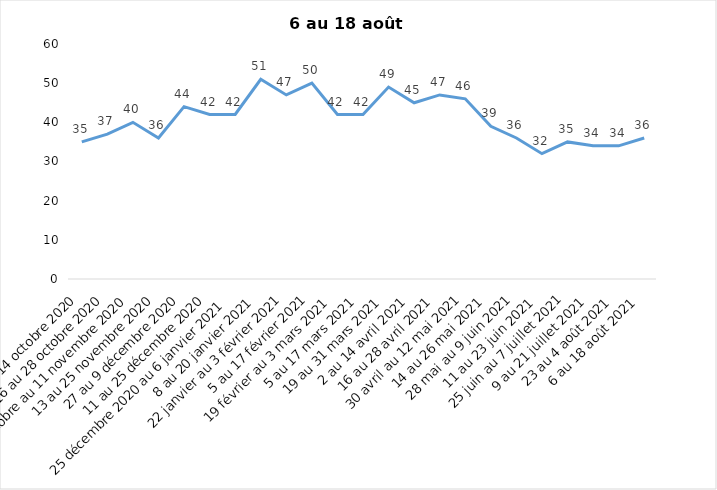
| Category | Toujours aux trois mesures |
|---|---|
| 2 au 14 octobre 2020 | 35 |
| 16 au 28 octobre 2020 | 37 |
| 30 octobre au 11 novembre 2020 | 40 |
| 13 au 25 novembre 2020 | 36 |
| 27 au 9 décembre 2020 | 44 |
| 11 au 25 décembre 2020 | 42 |
| 25 décembre 2020 au 6 janvier 2021 | 42 |
| 8 au 20 janvier 2021 | 51 |
| 22 janvier au 3 février 2021 | 47 |
| 5 au 17 février 2021 | 50 |
| 19 février au 3 mars 2021 | 42 |
| 5 au 17 mars 2021 | 42 |
| 19 au 31 mars 2021 | 49 |
| 2 au 14 avril 2021 | 45 |
| 16 au 28 avril 2021 | 47 |
| 30 avril au 12 mai 2021 | 46 |
| 14 au 26 mai 2021 | 39 |
| 28 mai au 9 juin 2021 | 36 |
| 11 au 23 juin 2021 | 32 |
| 25 juin au 7 juillet 2021 | 35 |
| 9 au 21 juillet 2021 | 34 |
| 23 au 4 août 2021 | 34 |
| 6 au 18 août 2021 | 36 |